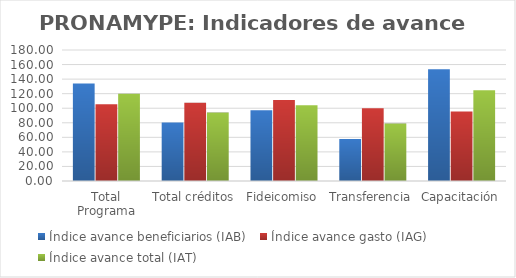
| Category | Índice avance beneficiarios (IAB)  | Índice avance gasto (IAG) | Índice avance total (IAT)  |
|---|---|---|---|
| Total Programa | 134.036 | 105.508 | 119.772 |
| Total créditos | 80.4 | 107.624 | 94.012 |
| Fideicomiso | 97.209 | 111.212 | 104.211 |
| Transferencia | 57.812 | 100 | 78.906 |
| Capacitación | 153.659 | 95.589 | 124.624 |